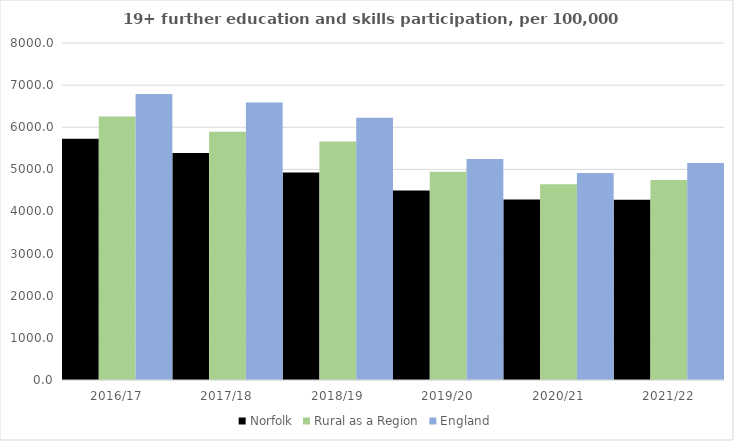
| Category | Norfolk | Rural as a Region | England |
|---|---|---|---|
| 2016/17 | 5727.892 | 6253.401 | 6788 |
| 2017/18 | 5386.639 | 5892.029 | 6588 |
| 2018/19 | 4928.255 | 5661.873 | 6227 |
| 2019/20 | 4496.438 | 4943.801 | 5244 |
| 2020/21 | 4287.628 | 4646.727 | 4913 |
| 2021/22 | 4278.501 | 4747.049 | 5151 |